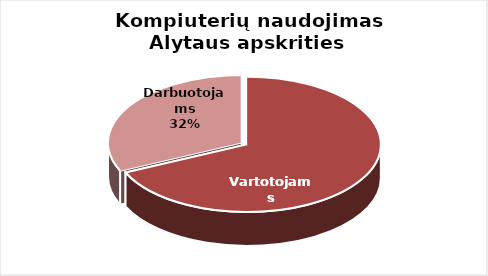
| Category | Series 0 |
|---|---|
| Vartotojams | 450 |
| Darbuotojams | 210 |